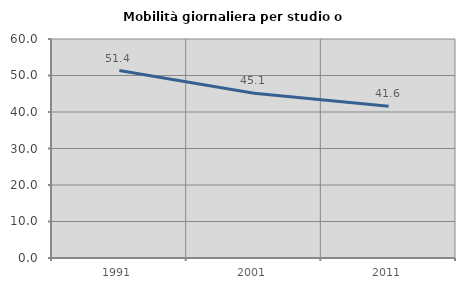
| Category | Mobilità giornaliera per studio o lavoro |
|---|---|
| 1991.0 | 51.37 |
| 2001.0 | 45.113 |
| 2011.0 | 41.608 |